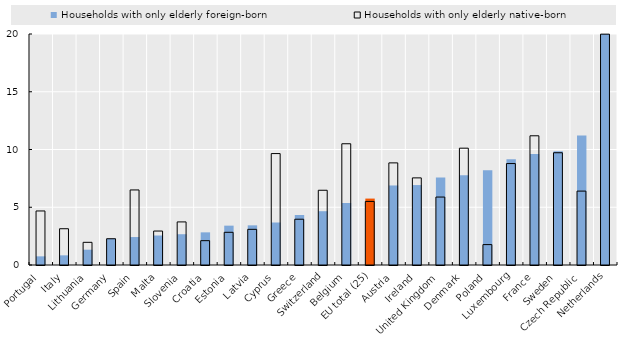
| Category | Households with only elderly foreign-born | Households with only elderly native-born |
|---|---|---|
| Portugal | 0.749 | 4.679 |
| Italy | 0.837 | 3.141 |
| Lithuania | 1.326 | 1.964 |
| Germany | 2.284 | 2.273 |
| Spain | 2.421 | 6.499 |
| Malta | 2.553 | 2.941 |
| Slovenia | 2.665 | 3.73 |
| Croatia | 2.827 | 2.107 |
| Estonia | 3.407 | 2.831 |
| Latvia | 3.433 | 3.088 |
| Cyprus | 3.68 | 9.648 |
| Greece | 4.331 | 3.964 |
| Switzerland | 4.658 | 6.472 |
| Belgium | 5.367 | 10.497 |
| EU total (25) | 5.751 | 5.504 |
| Austria | 6.886 | 8.841 |
| Ireland | 6.921 | 7.542 |
| United Kingdom | 7.586 | 5.883 |
| Denmark | 7.77 | 10.114 |
| Poland | 8.209 | 1.766 |
| Luxembourg | 9.159 | 8.783 |
| France | 9.616 | 11.186 |
| Sweden | 9.845 | 9.719 |
| Czech Republic | 11.216 | 6.398 |
| Netherlands | 21.978 | 19.987 |